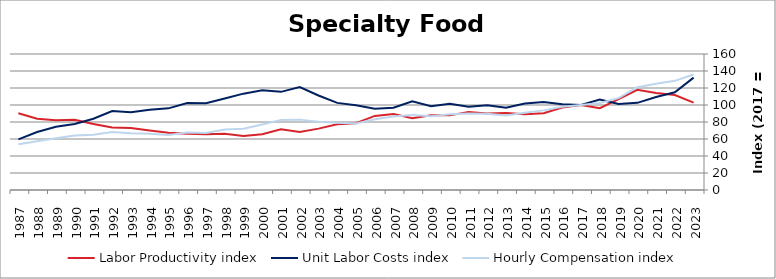
| Category | Labor Productivity index | Unit Labor Costs index | Hourly Compensation index |
|---|---|---|---|
| 2023.0 | 102.762 | 132.164 | 135.815 |
| 2022.0 | 111.763 | 114.905 | 128.421 |
| 2021.0 | 114.184 | 109.453 | 124.979 |
| 2020.0 | 117.953 | 102.552 | 120.962 |
| 2019.0 | 106.822 | 101.121 | 108.02 |
| 2018.0 | 96.228 | 106.364 | 102.352 |
| 2017.0 | 100 | 100 | 100 |
| 2016.0 | 97.067 | 100.996 | 98.033 |
| 2015.0 | 90.383 | 103.643 | 93.676 |
| 2014.0 | 89.2 | 101.79 | 90.797 |
| 2013.0 | 90.572 | 96.735 | 87.615 |
| 2012.0 | 89.967 | 99.608 | 89.615 |
| 2011.0 | 91.746 | 98.032 | 89.941 |
| 2010.0 | 87.797 | 101.549 | 89.157 |
| 2009.0 | 87.907 | 98.57 | 86.65 |
| 2008.0 | 84.509 | 104.474 | 88.29 |
| 2007.0 | 89.467 | 96.748 | 86.558 |
| 2006.0 | 87.149 | 95.627 | 83.338 |
| 2005.0 | 78.517 | 99.795 | 78.356 |
| 2004.0 | 77.263 | 102.478 | 79.178 |
| 2003.0 | 72.208 | 111.213 | 80.305 |
| 2002.0 | 68.347 | 121.134 | 82.792 |
| 2001.0 | 71.443 | 115.457 | 82.485 |
| 2000.0 | 65.639 | 117.295 | 76.991 |
| 1999.0 | 63.515 | 113.353 | 71.996 |
| 1998.0 | 66.12 | 107.682 | 71.199 |
| 1997.0 | 65.731 | 102.185 | 67.167 |
| 1996.0 | 66.149 | 102.25 | 67.637 |
| 1995.0 | 67.429 | 96.042 | 64.761 |
| 1994.0 | 70.038 | 94.547 | 66.219 |
| 1993.0 | 72.958 | 91.444 | 66.716 |
| 1992.0 | 73.406 | 92.884 | 68.182 |
| 1991.0 | 77.582 | 83.776 | 64.995 |
| 1990.0 | 82.743 | 77.565 | 64.18 |
| 1989.0 | 82.058 | 74.321 | 60.986 |
| 1988.0 | 83.903 | 68.205 | 57.226 |
| 1987.0 | 90.361 | 59.54 | 53.801 |